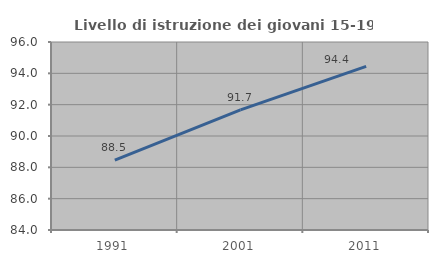
| Category | Livello di istruzione dei giovani 15-19 anni |
|---|---|
| 1991.0 | 88.462 |
| 2001.0 | 91.667 |
| 2011.0 | 94.444 |